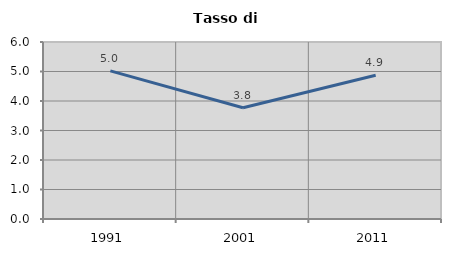
| Category | Tasso di disoccupazione   |
|---|---|
| 1991.0 | 5.02 |
| 2001.0 | 3.769 |
| 2011.0 | 4.872 |